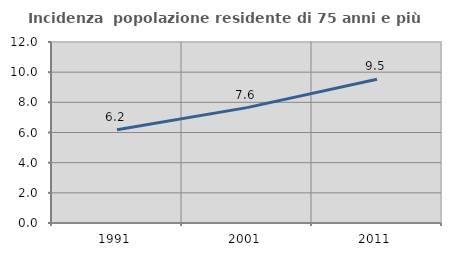
| Category | Incidenza  popolazione residente di 75 anni e più |
|---|---|
| 1991.0 | 6.182 |
| 2001.0 | 7.649 |
| 2011.0 | 9.528 |